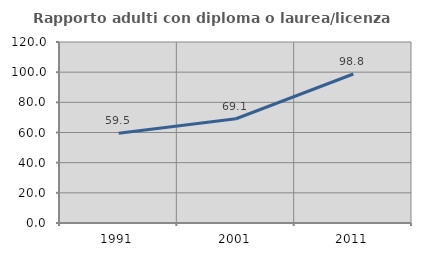
| Category | Rapporto adulti con diploma o laurea/licenza media  |
|---|---|
| 1991.0 | 59.524 |
| 2001.0 | 69.106 |
| 2011.0 | 98.789 |